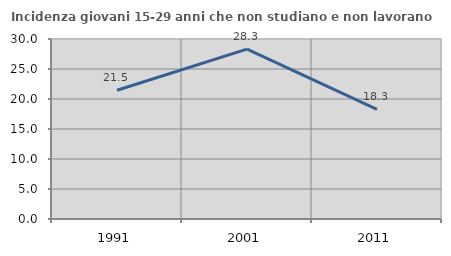
| Category | Incidenza giovani 15-29 anni che non studiano e non lavorano  |
|---|---|
| 1991.0 | 21.454 |
| 2001.0 | 28.302 |
| 2011.0 | 18.254 |